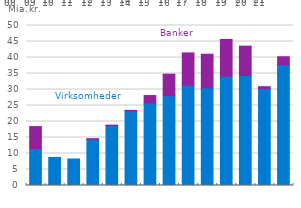
| Category | Series 0 | Series 1 |
|---|---|---|
| 0 | 11.55 | 6.86 |
| 1 | 8.78 | 0 |
| 2 | 8.29 | 0 |
| 3 | 14.44 | 0.18 |
| 4 | 18.77 | 0.1 |
| 5 | 23.35 | 0.13 |
| 6 | 25.77 | 2.34 |
| 7 | 28.06 | 6.73 |
| 8 | 31.36 | 10.07 |
| 9 | 30.5 | 10.52 |
| 10 | 34.14 | 11.51 |
| 11 | 34.36 | 9.19 |
| 12 | 30.36 | 0.52 |
| 13 | 37.77 | 2.46 |